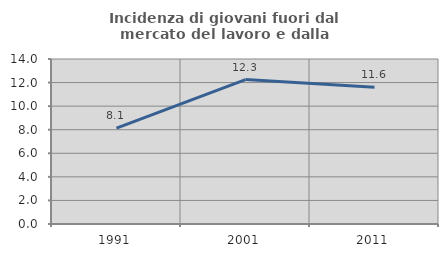
| Category | Incidenza di giovani fuori dal mercato del lavoro e dalla formazione  |
|---|---|
| 1991.0 | 8.135 |
| 2001.0 | 12.254 |
| 2011.0 | 11.602 |